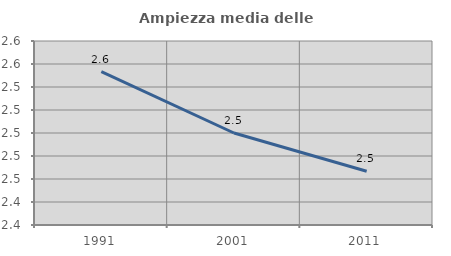
| Category | Ampiezza media delle famiglie |
|---|---|
| 1991.0 | 2.553 |
| 2001.0 | 2.5 |
| 2011.0 | 2.467 |